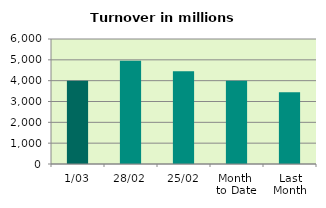
| Category | Series 0 |
|---|---|
| 1/03 | 3996.815 |
| 28/02 | 4951.108 |
| 25/02 | 4454.053 |
| Month 
to Date | 3996.815 |
| Last
Month | 3445.759 |